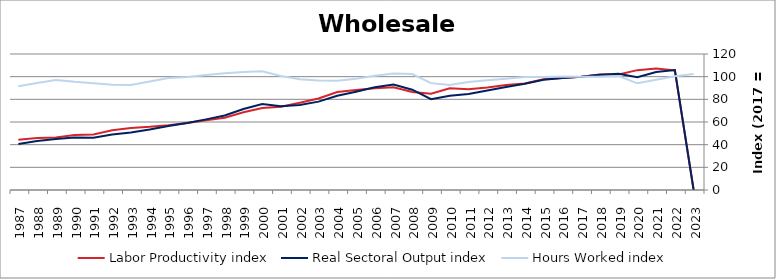
| Category | Labor Productivity index | Real Sectoral Output index | Hours Worked index |
|---|---|---|---|
| 2023.0 | 0 | 0 | 102.404 |
| 2022.0 | 105.475 | 105.834 | 100.341 |
| 2021.0 | 107.117 | 104.152 | 97.232 |
| 2020.0 | 105.767 | 99.545 | 94.117 |
| 2019.0 | 102.003 | 102.492 | 100.479 |
| 2018.0 | 101.842 | 101.75 | 99.909 |
| 2017.0 | 100 | 100 | 100 |
| 2016.0 | 98.782 | 98.841 | 100.06 |
| 2015.0 | 97.669 | 97.332 | 99.655 |
| 2014.0 | 94.003 | 93.816 | 99.8 |
| 2013.0 | 92.606 | 90.808 | 98.058 |
| 2012.0 | 90.541 | 87.718 | 96.881 |
| 2011.0 | 88.891 | 84.727 | 95.316 |
| 2010.0 | 89.837 | 83.157 | 92.564 |
| 2009.0 | 84.941 | 80.092 | 94.291 |
| 2008.0 | 86.553 | 88.5 | 102.25 |
| 2007.0 | 90.554 | 93.019 | 102.722 |
| 2006.0 | 89.847 | 90.602 | 100.841 |
| 2005.0 | 88.285 | 86.725 | 98.232 |
| 2004.0 | 86.379 | 83.213 | 96.335 |
| 2003.0 | 80.755 | 77.968 | 96.549 |
| 2002.0 | 76.913 | 75.089 | 97.628 |
| 2001.0 | 73.504 | 73.933 | 100.584 |
| 2000.0 | 72.371 | 75.877 | 104.844 |
| 1999.0 | 68.615 | 71.448 | 104.128 |
| 1998.0 | 63.739 | 65.692 | 103.065 |
| 1997.0 | 61.466 | 62.321 | 101.392 |
| 1996.0 | 59.212 | 59.066 | 99.754 |
| 1995.0 | 57.227 | 56.537 | 98.794 |
| 1994.0 | 55.741 | 53.371 | 95.748 |
| 1993.0 | 54.657 | 50.648 | 92.666 |
| 1992.0 | 52.767 | 48.995 | 92.852 |
| 1991.0 | 48.933 | 46.111 | 94.233 |
| 1990.0 | 48.499 | 46.273 | 95.41 |
| 1989.0 | 46.296 | 44.936 | 97.063 |
| 1988.0 | 45.775 | 43.247 | 94.478 |
| 1987.0 | 44.352 | 40.575 | 91.484 |